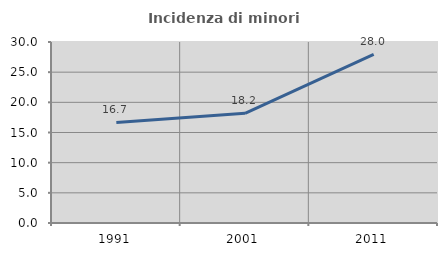
| Category | Incidenza di minori stranieri |
|---|---|
| 1991.0 | 16.667 |
| 2001.0 | 18.182 |
| 2011.0 | 27.964 |